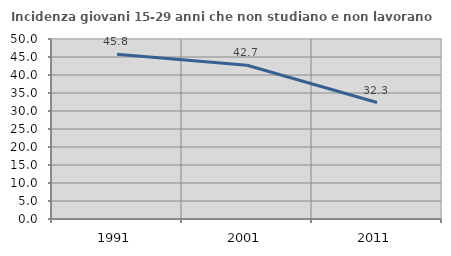
| Category | Incidenza giovani 15-29 anni che non studiano e non lavorano  |
|---|---|
| 1991.0 | 45.789 |
| 2001.0 | 42.717 |
| 2011.0 | 32.343 |